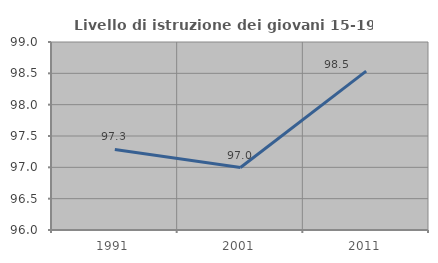
| Category | Livello di istruzione dei giovani 15-19 anni |
|---|---|
| 1991.0 | 97.286 |
| 2001.0 | 96.997 |
| 2011.0 | 98.535 |